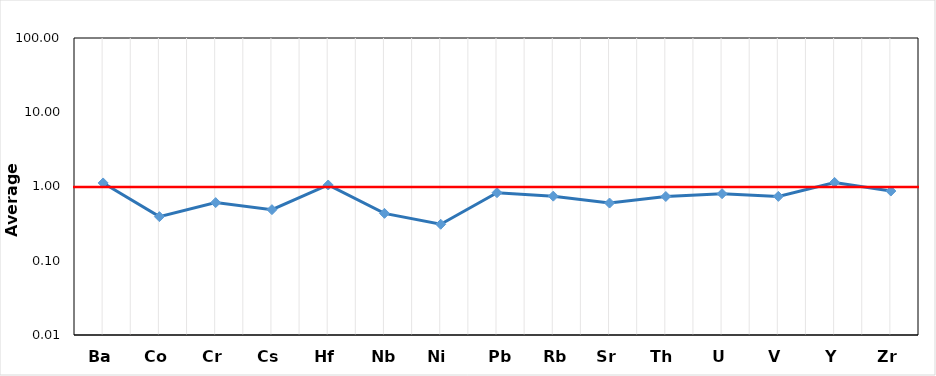
| Category | PFB |
|---|---|
| 0 | 1.116 |
| 1 | 0.393 |
| 2 | 0.607 |
| 3 | 0.487 |
| 4 | 1.048 |
| 5 | 0.435 |
| 6 | 0.31 |
| 7 | 0.824 |
| 8 | 0.741 |
| 9 | 0.599 |
| 10 | 0.733 |
| 11 | 0.8 |
| 12 | 0.736 |
| 13 | 1.135 |
| 14 | 0.869 |